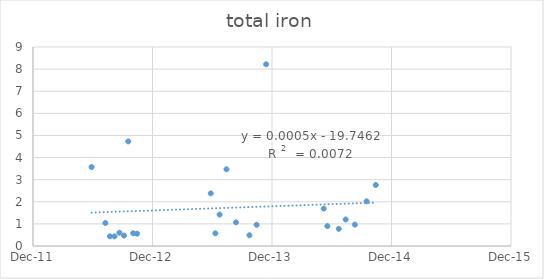
| Category | Series 0 |
|---|---|
| 41059.0 | 3.57 |
| 41101.0 | 1.04 |
| 41115.0 | 0.438 |
| 41129.0 | 0.434 |
| 41144.0 | 0.598 |
| 41158.0 | 0.471 |
| 41171.0 | 4.73 |
| 41186.0 | 0.576 |
| 41198.0 | 0.558 |
| 41423.0 | 2.38 |
| 41437.0 | 0.573 |
| 41450.0 | 1.42 |
| 41471.0 | 3.47 |
| 41500.0 | 1.07 |
| 41541.0 | 0.486 |
| 41563.0 | 0.958 |
| 41592.0 | 8.22 |
| 41768.0 | 1.69 |
| 41779.0 | 0.9 |
| 41814.0 | 0.775 |
| 41835.0 | 1.2 |
| 41863.0 | 0.966 |
| 41899.0 | 2.02 |
| 41927.0 | 2.76 |